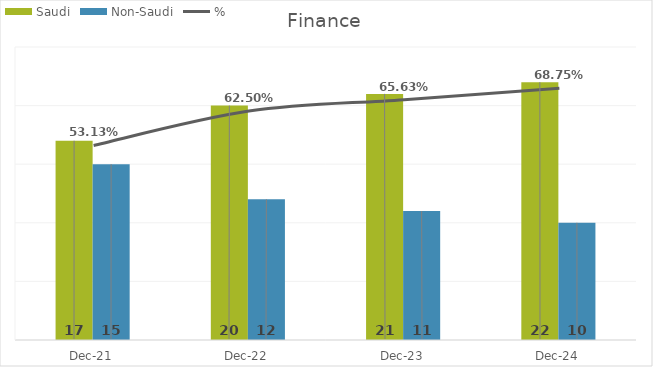
| Category | Saudi | Non-Saudi |
|---|---|---|
| Dec-21 | 17 | 15 |
| Dec-22 | 20 | 12 |
| Dec-23 | 21 | 11 |
| Dec-24 | 22 | 10 |